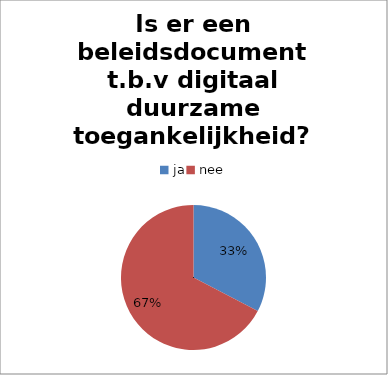
| Category | Series 0 |
|---|---|
| ja | 33 |
| nee | 68 |